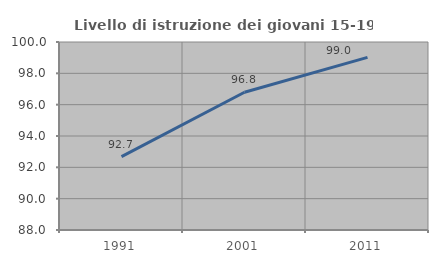
| Category | Livello di istruzione dei giovani 15-19 anni |
|---|---|
| 1991.0 | 92.683 |
| 2001.0 | 96.795 |
| 2011.0 | 99.02 |